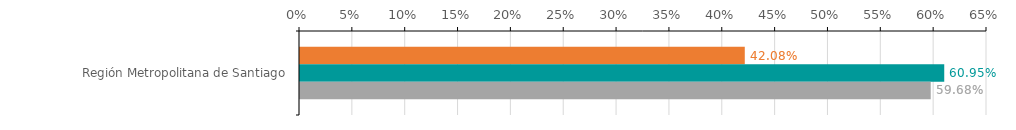
| Category | Numero de operaciones | Monto ($ MM) | Garantia ($ MM) |
|---|---|---|---|
| Región Metropolitana de Santiago | 0.421 | 0.61 | 0.597 |